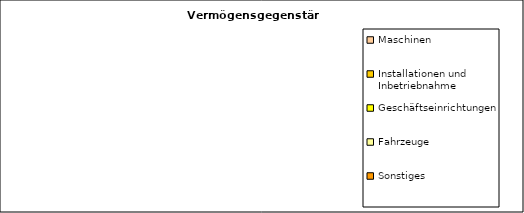
| Category | Series 0 |
|---|---|
| Maschinen | 0 |
| Installationen und Inbetriebnahme | 0 |
| Geschäftseinrichtungen | 0 |
| Fahrzeuge | 0 |
| Sonstiges | 0 |